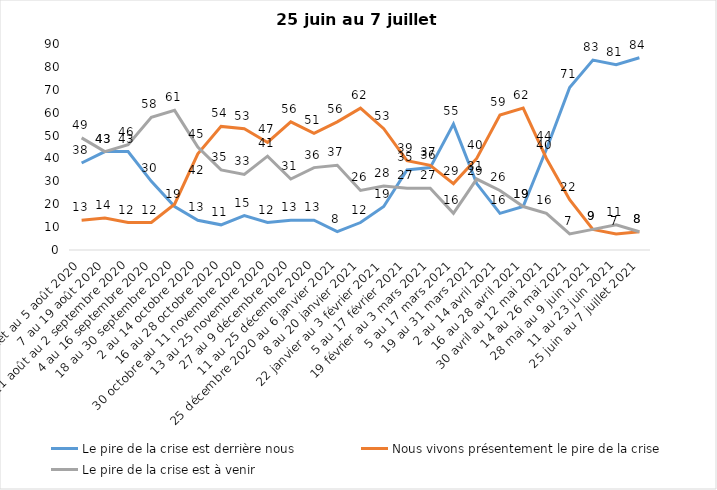
| Category | Le pire de la crise est derrière nous | Nous vivons présentement le pire de la crise | Le pire de la crise est à venir |
|---|---|---|---|
| 24 juillet au 5 août 2020 | 38 | 13 | 49 |
| 7 au 19 août 2020 | 43 | 14 | 43 |
| 21 août au 2 septembre 2020 | 43 | 12 | 46 |
| 4 au 16 septembre 2020 | 30 | 12 | 58 |
| 18 au 30 septembre 2020 | 19 | 20 | 61 |
| 2 au 14 octobre 2020 | 13 | 42 | 45 |
| 16 au 28 octobre 2020 | 11 | 54 | 35 |
| 30 octobre au 11 novembre 2020 | 15 | 53 | 33 |
| 13 au 25 novembre 2020 | 12 | 47 | 41 |
| 27 au 9 décembre 2020 | 13 | 56 | 31 |
| 11 au 25 décembre 2020 | 13 | 51 | 36 |
| 25 décembre 2020 au 6 janvier 2021 | 8 | 56 | 37 |
| 8 au 20 janvier 2021 | 12 | 62 | 26 |
| 22 janvier au 3 février 2021 | 19 | 53 | 28 |
| 5 au 17 février 2021 | 35 | 39 | 27 |
| 19 février au 3 mars 2021 | 36 | 37 | 27 |
| 5 au 17 mars 2021 | 55 | 29 | 16 |
| 19 au 31 mars 2021 | 29 | 40 | 31 |
| 2 au 14 avril 2021 | 16 | 59 | 26 |
| 16 au 28 avril 2021 | 19 | 62 | 19 |
| 30 avril au 12 mai 2021 | 44 | 40 | 16 |
| 14 au 26 mai 2021 | 71 | 22 | 7 |
| 28 mai au 9 juin 2021 | 83 | 9 | 9 |
| 11 au 23 juin 2021 | 81 | 7 | 11 |
| 25 juin au 7 juillet 2021 | 84 | 8 | 8 |